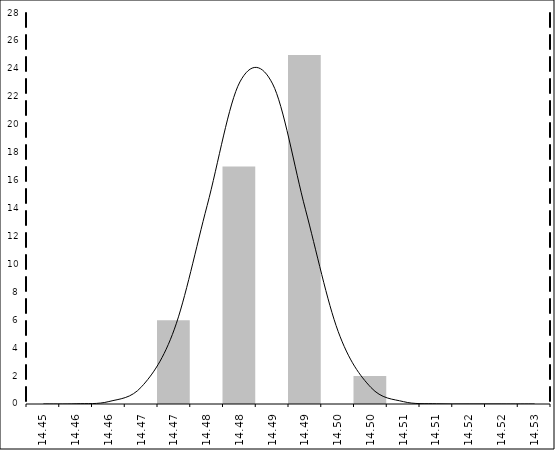
| Category | Series 1 |
|---|---|
| 14.45 | 0 |
| 14.455333333333332 | 0 |
| 14.460666666666665 | 0 |
| 14.465999999999998 | 0 |
| 14.47133333333333 | 6 |
| 14.476666666666663 | 0 |
| 14.481999999999996 | 17 |
| 14.487333333333329 | 0 |
| 14.492666666666661 | 25 |
| 14.497999999999994 | 0 |
| 14.503333333333327 | 2 |
| 14.50866666666666 | 0 |
| 14.513999999999992 | 0 |
| 14.519333333333325 | 0 |
| 14.524666666666658 | 0 |
| 14.53 | 0 |